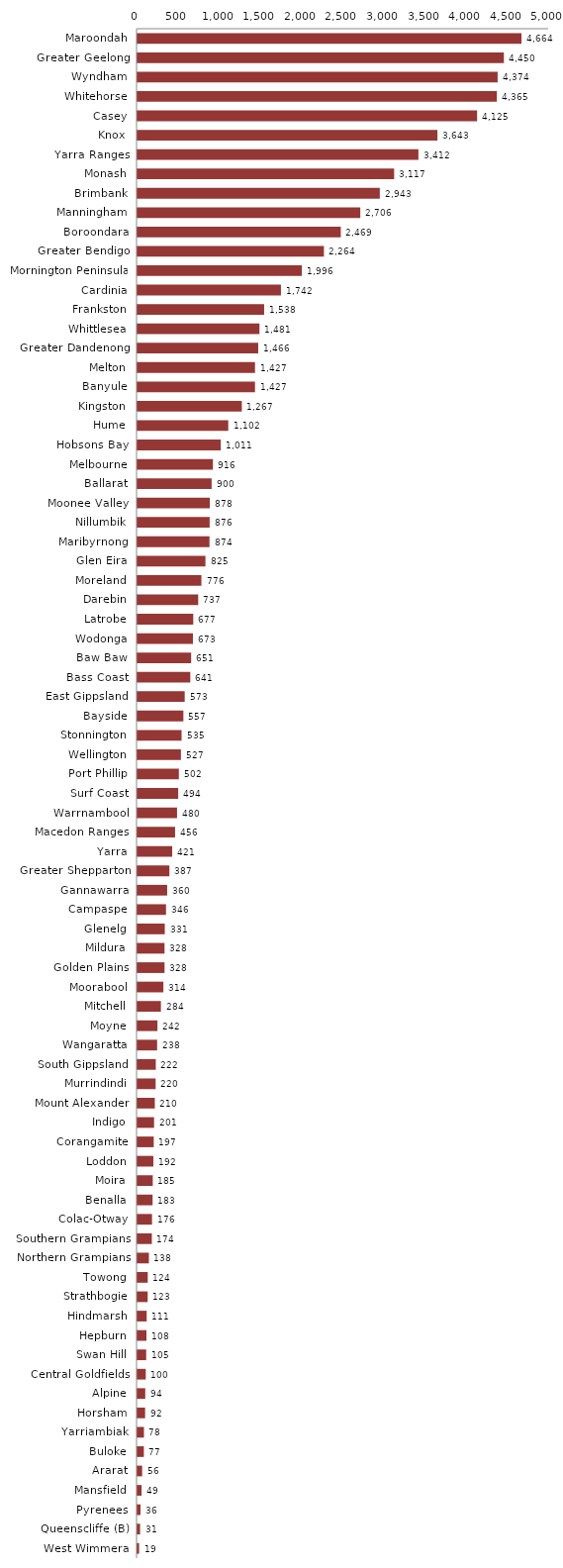
| Category | Series 0 |
|---|---|
| Maroondah | 4664 |
| Greater Geelong | 4450 |
| Wyndham | 4374 |
| Whitehorse | 4365 |
| Casey | 4125 |
| Knox | 3643 |
| Yarra Ranges | 3412 |
| Monash | 3117 |
| Brimbank | 2943 |
| Manningham | 2706 |
| Boroondara | 2469 |
| Greater Bendigo | 2264 |
| Mornington Peninsula | 1996 |
| Cardinia | 1742 |
| Frankston | 1538 |
| Whittlesea | 1481 |
| Greater Dandenong | 1466 |
| Melton | 1427 |
| Banyule | 1427 |
| Kingston | 1267 |
| Hume | 1102 |
| Hobsons Bay | 1011 |
| Melbourne | 916 |
| Ballarat | 900 |
| Moonee Valley | 878 |
| Nillumbik | 876 |
| Maribyrnong | 874 |
| Glen Eira | 825 |
| Moreland | 776 |
| Darebin | 737 |
| Latrobe | 677 |
| Wodonga | 673 |
| Baw Baw | 651 |
| Bass Coast | 641 |
| East Gippsland | 573 |
| Bayside | 557 |
| Stonnington | 535 |
| Wellington | 527 |
| Port Phillip | 502 |
| Surf Coast | 494 |
| Warrnambool | 480 |
| Macedon Ranges | 456 |
| Yarra | 421 |
| Greater Shepparton | 387 |
| Gannawarra | 360 |
| Campaspe | 346 |
| Glenelg | 331 |
| Mildura | 328 |
| Golden Plains | 328 |
| Moorabool | 314 |
| Mitchell | 284 |
| Moyne | 242 |
| Wangaratta | 238 |
| South Gippsland | 222 |
| Murrindindi | 220 |
| Mount Alexander | 210 |
| Indigo | 201 |
| Corangamite | 197 |
| Loddon | 192 |
| Moira | 185 |
| Benalla | 183 |
| Colac-Otway | 176 |
| Southern Grampians | 174 |
| Northern Grampians | 138 |
| Towong | 124 |
| Strathbogie | 123 |
| Hindmarsh | 111 |
| Hepburn | 108 |
| Swan Hill | 105 |
| Central Goldfields | 100 |
| Alpine | 94 |
| Horsham | 92 |
| Yarriambiak | 78 |
| Buloke | 77 |
| Ararat | 56 |
| Mansfield | 49 |
| Pyrenees | 36 |
| Queenscliffe (B) | 31 |
| West Wimmera | 19 |